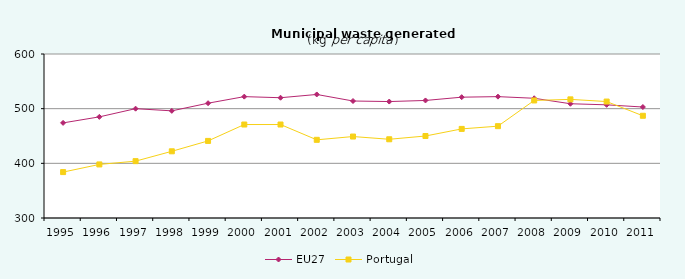
| Category | EU27 | Portugal |
|---|---|---|
| 1995.0 | 474 | 384 |
| 1996.0 | 485 | 398 |
| 1997.0 | 500 | 404 |
| 1998.0 | 496 | 422 |
| 1999.0 | 510 | 441 |
| 2000.0 | 522 | 471 |
| 2001.0 | 520 | 471 |
| 2002.0 | 526 | 443 |
| 2003.0 | 514 | 449 |
| 2004.0 | 513 | 444 |
| 2005.0 | 515 | 450 |
| 2006.0 | 521 | 463 |
| 2007.0 | 522 | 468 |
| 2008.0 | 519 | 515 |
| 2009.0 | 509 | 517 |
| 2010.0 | 507 | 513 |
| 2011.0 | 503 | 487 |